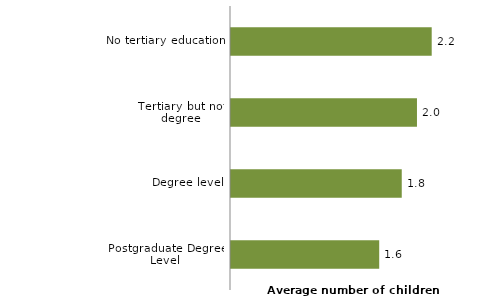
| Category | Series 0 |
|---|---|
| Postgraduate Degree Level | 1.597 |
| Degree level | 1.84 |
| Tertiary but not degree | 2.004 |
| No tertiary education | 2.163 |